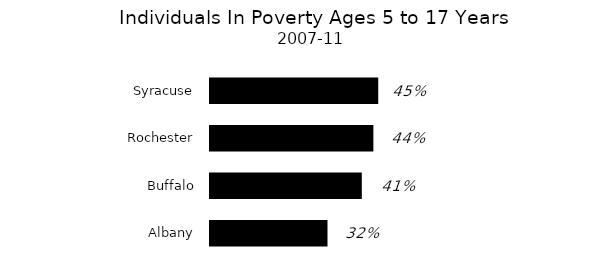
| Category | Series 0 |
|---|---|
| Albany | 0.315 |
| Buffalo | 0.407 |
| Rochester | 0.438 |
| Syracuse | 0.451 |